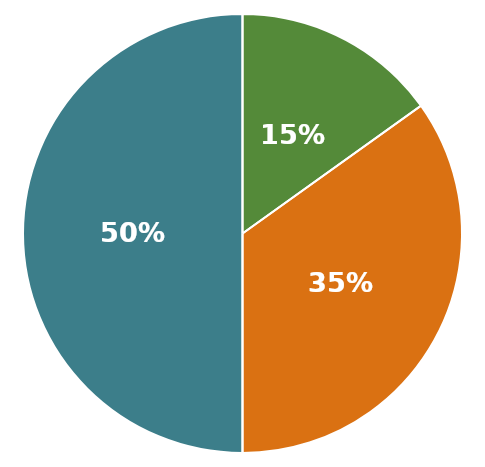
| Category | Total de Ativos |
|---|---|
| 0 | 1902500 |
| 1 | 575000 |
| 2 | 1327500 |